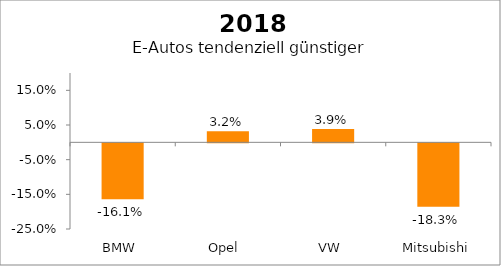
| Category | Series 0 |
|---|---|
| BMW  | -0.161 |
| Opel  | 0.032 |
| VW  | 0.039 |
| Mitsubishi | -0.183 |